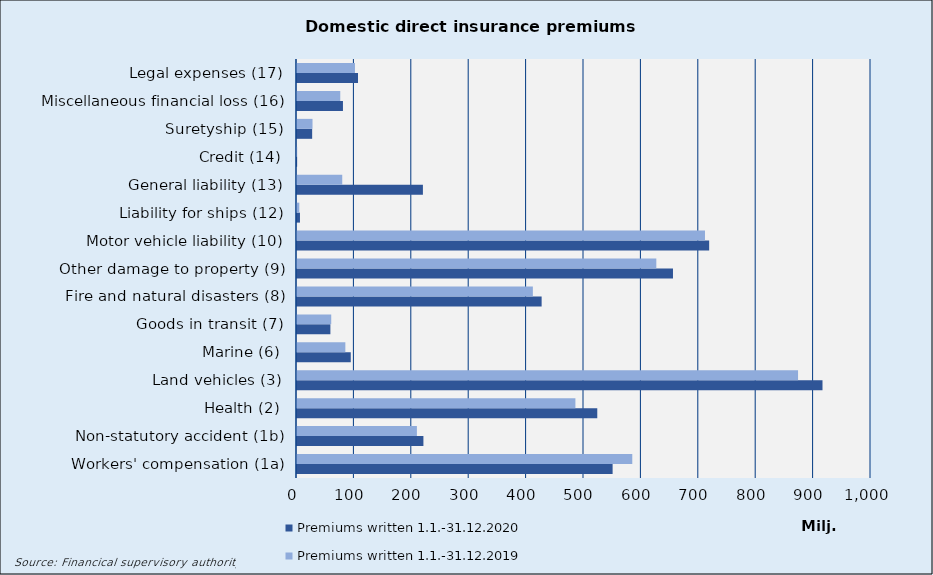
| Category | Premiums written |
|---|---|
| Workers' compensation (1a) | 584107.618 |
| Non-statutory accident (1b) | 208878.114 |
| Health (2) | 485031.084 |
| Land vehicles (3) | 872909.039 |
| Marine (6) | 84239.323 |
| Goods in transit (7) | 59637.354 |
| Fire and natural disasters (8) | 410901.802 |
| Other damage to property (9) | 625996.929 |
| Motor vehicle liability (10) | 710774.018 |
| Liability for ships (12) | 4030.047 |
| General liability (13) | 78821.021 |
| Credit (14) | 276.984 |
| Suretyship (15) | 27025.959 |
| Miscellaneous financial loss (16) | 75381.89 |
| Legal expenses (17) | 100971.288 |